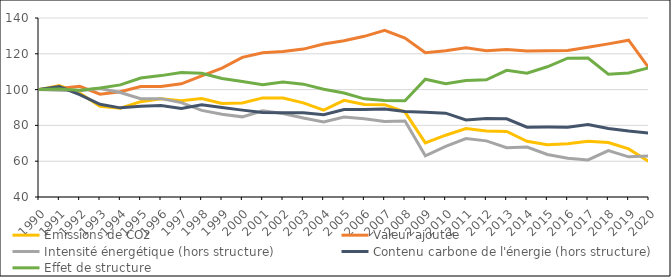
| Category | Émissions de CO2 | Valeur ajoutée | Intensité énergétique (hors structure) | Contenu carbone de l'énergie (hors structure) | Effet de structure |
|---|---|---|---|---|---|
| 1990.0 | 100 | 100 | 100 | 100 | 100 |
| 1991.0 | 102.212 | 100.566 | 99.67 | 101.647 | 100.321 |
| 1992.0 | 98.062 | 101.856 | 99.37 | 97.171 | 99.706 |
| 1993.0 | 90.696 | 97.436 | 100.548 | 91.8 | 100.845 |
| 1994.0 | 89.577 | 98.763 | 98.398 | 89.799 | 102.648 |
| 1995.0 | 93.256 | 101.747 | 94.898 | 90.733 | 106.448 |
| 1996.0 | 94.9 | 101.686 | 94.951 | 91.165 | 107.814 |
| 1997.0 | 93.84 | 103.237 | 92.725 | 89.46 | 109.578 |
| 1998.0 | 94.996 | 107.723 | 88.374 | 91.483 | 109.076 |
| 1999.0 | 92.237 | 111.958 | 86.22 | 89.995 | 106.175 |
| 2000.0 | 92.559 | 118.018 | 84.773 | 88.532 | 104.499 |
| 2001.0 | 95.376 | 120.628 | 88.218 | 87.238 | 102.738 |
| 2002.0 | 95.341 | 121.253 | 86.665 | 87.071 | 104.201 |
| 2003.0 | 92.612 | 122.626 | 84.137 | 87.118 | 103.036 |
| 2004.0 | 88.492 | 125.472 | 81.885 | 85.941 | 100.22 |
| 2005.0 | 93.988 | 127.341 | 84.654 | 88.853 | 98.126 |
| 2006.0 | 91.655 | 129.756 | 83.772 | 88.915 | 94.832 |
| 2007.0 | 91.6 | 133.069 | 82.209 | 89.113 | 93.963 |
| 2008.0 | 87.425 | 128.801 | 82.443 | 87.806 | 93.765 |
| 2009.0 | 70.272 | 120.586 | 63.014 | 87.385 | 105.832 |
| 2010.0 | 74.523 | 121.732 | 68.23 | 86.856 | 103.303 |
| 2011.0 | 78.246 | 123.344 | 72.658 | 83.071 | 105.104 |
| 2012.0 | 76.877 | 121.735 | 71.369 | 83.88 | 105.491 |
| 2013.0 | 76.594 | 122.338 | 67.535 | 83.698 | 110.761 |
| 2014.0 | 71.134 | 121.523 | 67.909 | 78.984 | 109.132 |
| 2015.0 | 69.231 | 121.697 | 63.757 | 79.133 | 112.755 |
| 2016.0 | 69.741 | 121.797 | 61.643 | 79.036 | 117.53 |
| 2017.0 | 71.092 | 123.65 | 60.714 | 80.503 | 117.633 |
| 2018.0 | 70.44 | 125.551 | 65.967 | 78.291 | 108.631 |
| 2019.0 | 66.898 | 127.602 | 62.453 | 76.834 | 109.256 |
| 2020.0 | 59.794 | 111.977 | 62.892 | 75.677 | 112.193 |